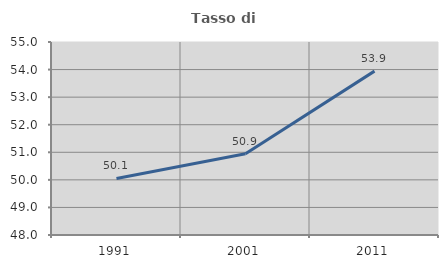
| Category | Tasso di occupazione   |
|---|---|
| 1991.0 | 50.05 |
| 2001.0 | 50.949 |
| 2011.0 | 53.944 |